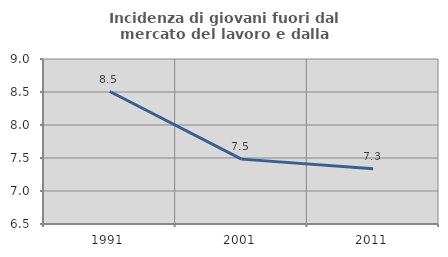
| Category | Incidenza di giovani fuori dal mercato del lavoro e dalla formazione  |
|---|---|
| 1991.0 | 8.507 |
| 2001.0 | 7.483 |
| 2011.0 | 7.337 |